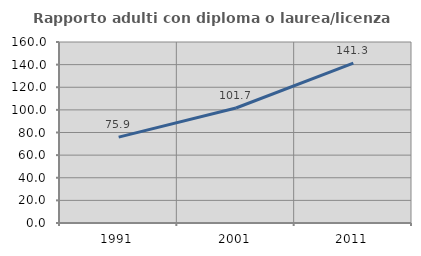
| Category | Rapporto adulti con diploma o laurea/licenza media  |
|---|---|
| 1991.0 | 75.949 |
| 2001.0 | 101.671 |
| 2011.0 | 141.292 |